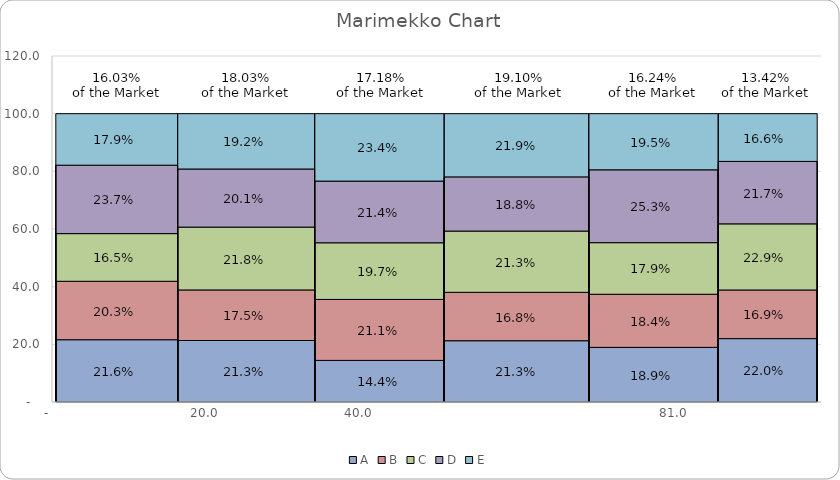
| Category | A | B | C | D | E |
|---|---|---|---|---|---|
| 0.0 | 0 | 0 | 0 | 0 | 0 |
| 0.0 | 21.6 | 20.267 | 16.533 | 23.733 | 17.867 |
| 16.025641025641026 | 21.6 | 20.267 | 16.533 | 23.733 | 17.867 |
| 16.025641025641026 | 0 | 0 | 0 | 0 | 0 |
| 16.025641025641026 | 21.327 | 17.536 | 21.801 | 20.142 | 19.194 |
| 34.059829059829056 | 21.327 | 17.536 | 21.801 | 20.142 | 19.194 |
| 34.059829059829056 | 0 | 0 | 0 | 0 | 0 |
| 34.059829059829056 | 14.428 | 21.144 | 19.652 | 21.393 | 23.383 |
| 51.23931623931624 | 14.428 | 21.144 | 19.652 | 21.393 | 23.383 |
| 51.23931623931624 | 0 | 0 | 0 | 0 | 0 |
| 51.23931623931624 | 21.253 | 16.779 | 21.253 | 18.792 | 21.924 |
| 70.34188034188034 | 21.253 | 16.779 | 21.253 | 18.792 | 21.924 |
| 70.34188034188034 | 0 | 0 | 0 | 0 | 0 |
| 70.34188034188034 | 18.947 | 18.421 | 17.895 | 25.263 | 19.474 |
| 86.58119658119658 | 18.947 | 18.421 | 17.895 | 25.263 | 19.474 |
| 86.58119658119658 | 0 | 0 | 0 | 0 | 0 |
| 86.58119658119658 | 21.975 | 16.879 | 22.93 | 21.656 | 16.561 |
| 100.0 | 21.975 | 16.879 | 22.93 | 21.656 | 16.561 |
| 100.0 | 0 | 0 | 0 | 0 | 0 |